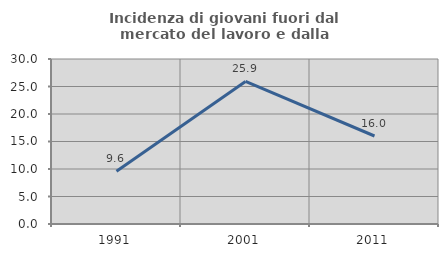
| Category | Incidenza di giovani fuori dal mercato del lavoro e dalla formazione  |
|---|---|
| 1991.0 | 9.589 |
| 2001.0 | 25.926 |
| 2011.0 | 16 |